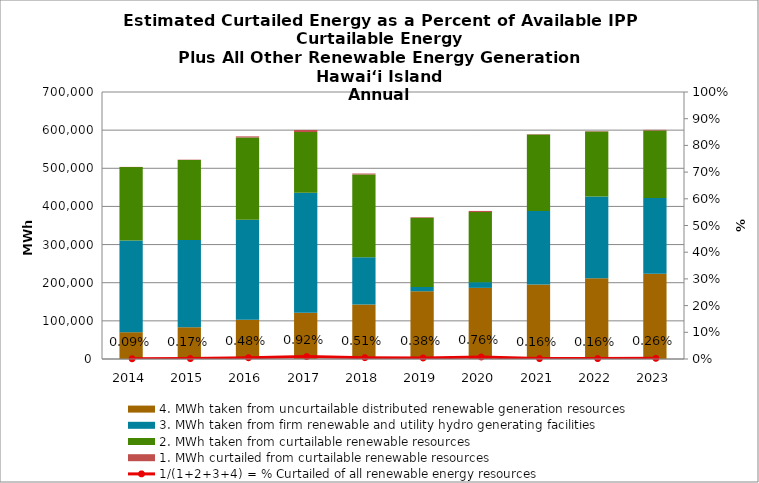
| Category | 4. MWh taken from uncurtailable distributed renewable generation resources | 3. MWh taken from firm renewable and utility hydro generating facilities | 2. MWh taken from curtailable renewable resources | 1. MWh curtailed from curtailable renewable resources |
|---|---|---|---|---|
| 2014.0 | 70262.437 | 240411.71 | 192465.802 | 467.979 |
| 2015.0 | 83255.401 | 228878.973 | 209595.357 | 862.42 |
| 2016.0 | 102758.825 | 262010.543 | 216088.171 | 2790.609 |
| 2017.0 | 121114.262 | 314678.95 | 159160.26 | 5505.755 |
| 2018.0 | 143002.822 | 123612.385 | 217153.319 | 2478.722 |
| 2019.0 | 177534.443 | 11469.59 | 181038.236 | 1425.862 |
| 2020.0 | 186444.032 | 15093.215 | 183700.619 | 2948.849 |
| 2021.0 | 195209.244 | 192695.167 | 200615.735 | 917.19 |
| 2022.0 | 211851.94 | 214442.978 | 170379.751 | 968 |
| 2023.0 | 223764.284 | 198082.646 | 177360.12 | 1566.421 |